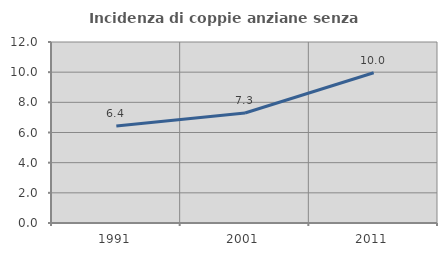
| Category | Incidenza di coppie anziane senza figli  |
|---|---|
| 1991.0 | 6.434 |
| 2001.0 | 7.292 |
| 2011.0 | 9.959 |